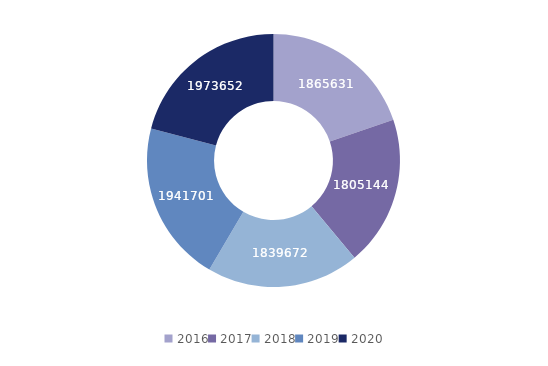
| Category | Series 0 |
|---|---|
| 2016.0 | 1865631 |
| 2017.0 | 1805144 |
| 2018.0 | 1839672 |
| 2019.0 | 1941701 |
| 2020.0 | 1973652 |